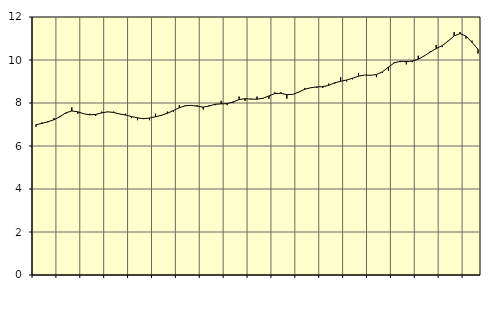
| Category | Piggar | Offentlig förvaltning m.m., SNI 84, 99 |
|---|---|---|
| nan | 6.9 | 6.99 |
| 1.0 | 7.1 | 7.05 |
| 1.0 | 7.1 | 7.13 |
| 1.0 | 7.3 | 7.22 |
| nan | 7.4 | 7.36 |
| 2.0 | 7.5 | 7.54 |
| 2.0 | 7.8 | 7.63 |
| 2.0 | 7.5 | 7.59 |
| nan | 7.5 | 7.5 |
| 3.0 | 7.5 | 7.45 |
| 3.0 | 7.4 | 7.47 |
| 3.0 | 7.6 | 7.54 |
| nan | 7.6 | 7.59 |
| 4.0 | 7.6 | 7.56 |
| 4.0 | 7.5 | 7.49 |
| 4.0 | 7.5 | 7.44 |
| nan | 7.3 | 7.37 |
| 5.0 | 7.2 | 7.31 |
| 5.0 | 7.3 | 7.27 |
| 5.0 | 7.2 | 7.3 |
| nan | 7.5 | 7.36 |
| 6.0 | 7.4 | 7.43 |
| 6.0 | 7.6 | 7.52 |
| 6.0 | 7.6 | 7.65 |
| nan | 7.9 | 7.78 |
| 7.0 | 7.9 | 7.87 |
| 7.0 | 7.9 | 7.89 |
| 7.0 | 7.9 | 7.85 |
| nan | 7.7 | 7.81 |
| 8.0 | 7.9 | 7.86 |
| 8.0 | 7.9 | 7.94 |
| 8.0 | 8.1 | 7.96 |
| nan | 7.9 | 7.97 |
| 9.0 | 8 | 8.05 |
| 9.0 | 8.3 | 8.16 |
| 9.0 | 8.1 | 8.2 |
| nan | 8.2 | 8.18 |
| 10.0 | 8.3 | 8.18 |
| 10.0 | 8.2 | 8.22 |
| 10.0 | 8.2 | 8.33 |
| nan | 8.5 | 8.44 |
| 11.0 | 8.5 | 8.45 |
| 11.0 | 8.2 | 8.39 |
| 11.0 | 8.4 | 8.4 |
| nan | 8.5 | 8.51 |
| 12.0 | 8.7 | 8.64 |
| 12.0 | 8.7 | 8.71 |
| 12.0 | 8.7 | 8.75 |
| nan | 8.7 | 8.76 |
| 13.0 | 8.9 | 8.82 |
| 13.0 | 8.9 | 8.94 |
| 13.0 | 9.2 | 9.01 |
| nan | 9 | 9.07 |
| 14.0 | 9.1 | 9.15 |
| 14.0 | 9.4 | 9.25 |
| 14.0 | 9.3 | 9.3 |
| nan | 9.3 | 9.29 |
| 15.0 | 9.2 | 9.32 |
| 15.0 | 9.4 | 9.45 |
| 15.0 | 9.5 | 9.67 |
| nan | 9.9 | 9.87 |
| 16.0 | 9.9 | 9.94 |
| 16.0 | 9.8 | 9.93 |
| 16.0 | 9.9 | 9.95 |
| nan | 10.2 | 10.04 |
| 17.0 | 10.2 | 10.19 |
| 17.0 | 10.4 | 10.37 |
| 17.0 | 10.7 | 10.53 |
| nan | 10.6 | 10.67 |
| 18.0 | 10.9 | 10.88 |
| 18.0 | 11.3 | 11.12 |
| 18.0 | 11.3 | 11.23 |
| nan | 11 | 11.11 |
| 19.0 | 10.9 | 10.82 |
| 19.0 | 10.3 | 10.5 |